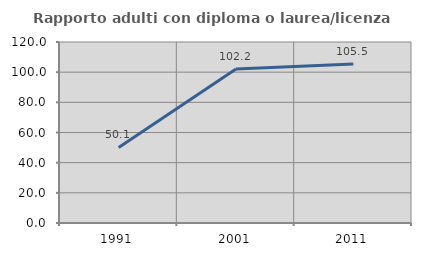
| Category | Rapporto adulti con diploma o laurea/licenza media  |
|---|---|
| 1991.0 | 50.125 |
| 2001.0 | 102.161 |
| 2011.0 | 105.466 |